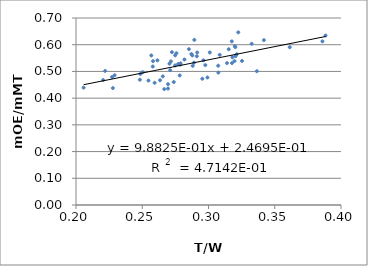
| Category | Series 0 |
|---|---|
| 0.30730507202836294 | 0.521 |
| 0.31396534148827726 | 0.531 |
| 0.3175968399592253 | 0.612 |
| 0.30844549848481695 | 0.562 |
| 0.3252814715550516 | 0.539 |
| 0.2747861543234499 | 0.523 |
| 0.28185290097098326 | 0.545 |
| 0.2205325305314596 | 0.468 |
| 0.2271949324997837 | 0.479 |
| 0.2634158602488375 | 0.467 |
| 0.27827349782860655 | 0.485 |
| 0.2219956960018122 | 0.502 |
| 0.22780919282445503 | 0.438 |
| 0.38598385767407073 | 0.613 |
| 0.22912931247432755 | 0.486 |
| 0.2770719641892269 | 0.528 |
| 0.32131663281108547 | 0.564 |
| 0.31772087361232404 | 0.531 |
| 0.32026717208951366 | 0.591 |
| 0.2568387627325076 | 0.56 |
| 0.26145173277870315 | 0.542 |
| 0.2788861547620071 | 0.53 |
| 0.25026121688707675 | 0.497 |
| 0.2546801250004586 | 0.466 |
| 0.2593437806029707 | 0.457 |
| 0.3365057753925094 | 0.501 |
| 0.3196189343255504 | 0.539 |
| 0.31986811425641093 | 0.595 |
| 0.29917875663585103 | 0.477 |
| 0.29117541319501056 | 0.557 |
| 0.3074335252112935 | 0.495 |
| 0.2877602707930676 | 0.56 |
| 0.265528774321672 | 0.481 |
| 0.2880667137992843 | 0.521 |
| 0.2057227920050113 | 0.439 |
| 0.2481939458405354 | 0.469 |
| 0.31525354266168565 | 0.583 |
| 0.25796251222201416 | 0.518 |
| 0.2716474749105564 | 0.538 |
| 0.2581200096954221 | 0.538 |
| 0.2748280318171238 | 0.56 |
| 0.27869820339773693 | 0.525 |
| 0.27106368479759685 | 0.505 |
| 0.2976233475402731 | 0.524 |
| 0.3204180734117826 | 0.557 |
| 0.28521409435760314 | 0.583 |
| 0.27375340933191966 | 0.46 |
| 0.295333599780289 | 0.473 |
| 0.2694364736154333 | 0.436 |
| 0.2694364736154333 | 0.452 |
| 0.2705467292217001 | 0.529 |
| 0.2666419547153492 | 0.434 |
| 0.2961830331860913 | 0.542 |
| 0.24857477252992033 | 0.49 |
| 0.2893270002385755 | 0.618 |
| 0.3180428134556575 | 0.553 |
| 0.2890126857240159 | 0.533 |
| 0.3224710356998016 | 0.646 |
| 0.27237748462988687 | 0.572 |
| 0.3009967690693632 | 0.571 |
| 0.2871056575787907 | 0.565 |
| 0.275787309001347 | 0.568 |
| 0.3883667487399275 | 0.634 |
| 0.3613373766104465 | 0.591 |
| 0.33256880733944955 | 0.603 |
| 0.341823997265408 | 0.617 |
| 0.2914507695412181 | 0.571 |